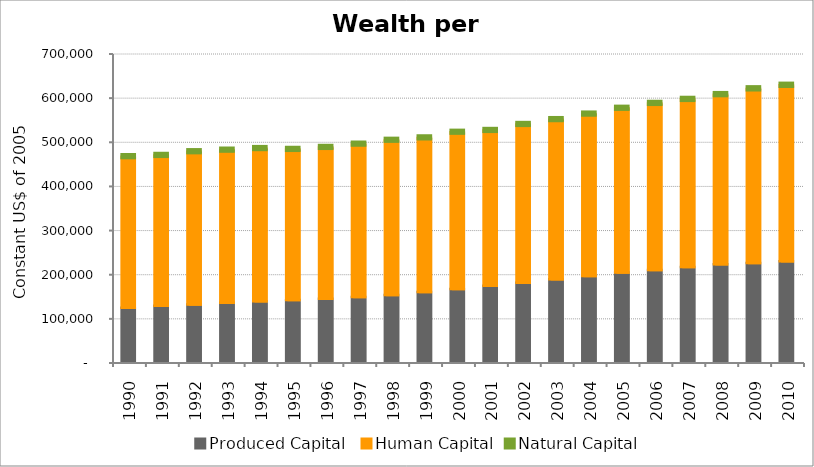
| Category | Produced Capital  | Human Capital | Natural Capital |
|---|---|---|---|
| 1990.0 | 122588.158 | 341798.684 | 2661.362 |
| 1991.0 | 127129.799 | 340086.463 | 2687.363 |
| 1992.0 | 129552.617 | 346031.034 | 2709.339 |
| 1993.0 | 133471.608 | 345648.389 | 2728.151 |
| 1994.0 | 136988.986 | 345738.25 | 2744.926 |
| 1995.0 | 139658.505 | 341149.532 | 2760.608 |
| 1996.0 | 142667.626 | 342631.066 | 2774.935 |
| 1997.0 | 146599.152 | 346110.66 | 2788.045 |
| 1998.0 | 151063.842 | 350403.562 | 2801.557 |
| 1999.0 | 157994.407 | 348909.537 | 2817.492 |
| 2000.0 | 164757.267 | 354894.614 | 2836.888 |
| 2001.0 | 172141.279 | 351608.796 | 2810.953 |
| 2002.0 | 178764.666 | 358531.943 | 2789.544 |
| 2003.0 | 186949.088 | 361350.533 | 2767.932 |
| 2004.0 | 194083.965 | 366724.602 | 2740.013 |
| 2005.0 | 201903.351 | 372109.832 | 2702.203 |
| 2006.0 | 207578.996 | 377493.73 | 2653.514 |
| 2007.0 | 214626.409 | 379514.133 | 2597.02 |
| 2008.0 | 221120.147 | 383877.465 | 2537.977 |
| 2009.0 | 223726.607 | 394436.574 | 2482.611 |
| 2010.0 | 227555.594 | 398644.086 | 2434.612 |